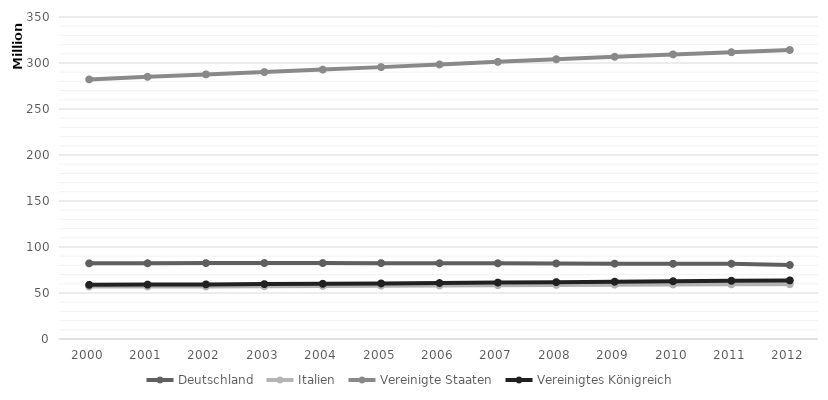
| Category | Deutschland  | Italien  | Vereinigte Staaten  | Vereinigtes Königreich  |
|---|---|---|---|---|
| 2000 | 82211508 | 56942108 | 282162411 | 58892514 |
| 2001 | 82349925 | 56974100 | 284968955 | 59119673 |
| 2002 | 82488495 | 57059007 | 287625193 | 59370479 |
| 2003 | 82534176 | 57313203 | 290107933 | 59647577 |
| 2004 | 82516260 | 57685327 | 292805298 | 59987905 |
| 2005 | 82469422 | 57969484 | 295516599 | 60401206 |
| 2006 | 82376451 | 58143979 | 298379912 | 60846820 |
| 2007 | 82266372 | 58438310 | 301231207 | 61322463 |
| 2008 | 82110097 | 58826731 | 304093966 | 61806995 |
| 2009 | 81902307 | 59095365 | 306771529 | 62276270 |
| 2010 | 81776930 | 59277417 | 309347057 | 62766365 |
| 2011 | 81797673 | 59379449 | 311721632 | 63258918 |
| 2012 | 80425823 | 59539717 | 314112078 | 63700300 |